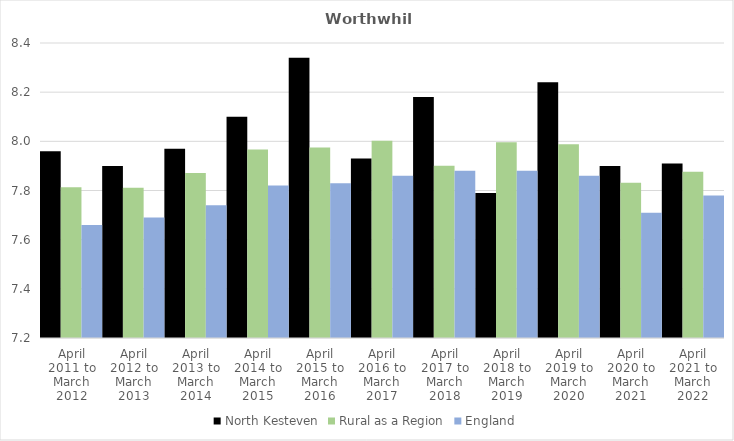
| Category | North Kesteven | Rural as a Region | England |
|---|---|---|---|
| April 2011 to March 2012 | 7.96 | 7.813 | 7.66 |
| April 2012 to March 2013 | 7.9 | 7.811 | 7.69 |
| April 2013 to March 2014 | 7.97 | 7.871 | 7.74 |
| April 2014 to March 2015 | 8.1 | 7.967 | 7.82 |
| April 2015 to March 2016 | 8.34 | 7.975 | 7.83 |
| April 2016 to March 2017 | 7.93 | 8.002 | 7.86 |
| April 2017 to March 2018 | 8.18 | 7.9 | 7.88 |
| April 2018 to March 2019 | 7.79 | 7.996 | 7.88 |
| April 2019 to March 2020 | 8.24 | 7.988 | 7.86 |
| April 2020 to March 2021 | 7.9 | 7.831 | 7.71 |
| April 2021 to March 2022 | 7.91 | 7.877 | 7.78 |